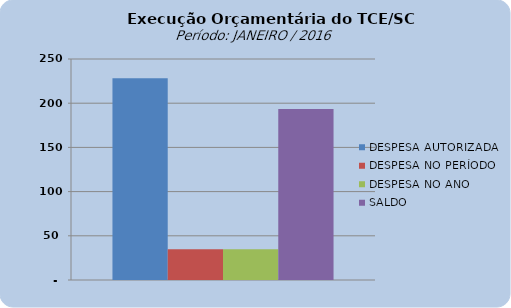
| Category | DESPESA AUTORIZADA | DESPESA NO PERÍODO | DESPESA NO ANO | SALDO |
|---|---|---|---|---|
| 0 | 228251880.27 | 34906112.55 | 34906112.55 | 193345767.72 |